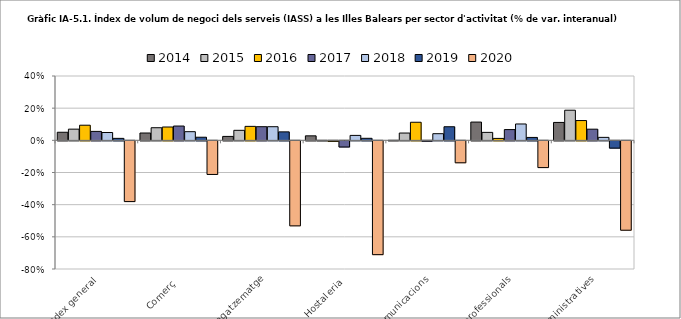
| Category | 2014 | 2015 | 2016 | 2017 | 2018 | 2019 | 2020 |
|---|---|---|---|---|---|---|---|
| Índex general | 0.05 | 0.07 | 0.094 | 0.056 | 0.049 | 0.012 | -0.378 |
| Comerç | 0.046 | 0.078 | 0.083 | 0.089 | 0.054 | 0.019 | -0.209 |
| Transport i emmagatzematge | 0.024 | 0.062 | 0.087 | 0.085 | 0.085 | 0.053 | -0.529 |
| Hostaleria | 0.028 | -0.001 | -0.003 | -0.038 | 0.031 | 0.013 | -0.708 |
| Informació i comunicacions | 0 | 0.045 | 0.112 | -0.002 | 0.041 | 0.085 | -0.136 |
| Activitats professionals | 0.114 | 0.049 | 0.012 | 0.067 | 0.102 | 0.018 | -0.166 |
| Activitats administratives | 0.111 | 0.187 | 0.123 | 0.069 | 0.018 | -0.045 | -0.556 |